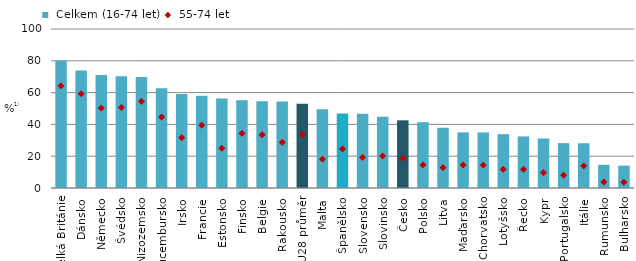
| Category |  Celkem (16-74 let) |
|---|---|
| Velká Británie | 80.082 |
| Dánsko | 73.886 |
| Německo | 71.008 |
| Švédsko | 70.286 |
| Nizozemsko | 69.882 |
| Lucembursko | 62.713 |
| Irsko | 59.195 |
| Francie | 57.962 |
| Estonsko | 56.297 |
| Finsko | 55.226 |
| Belgie | 54.606 |
| Rakousko | 54.433 |
| EU28 průměr | 52.918 |
| Malta | 49.548 |
| Španělsko | 46.925 |
| Slovensko | 46.762 |
| Slovinsko | 44.791 |
| Česko | 42.564 |
| Polsko | 41.385 |
| Litva | 37.877 |
| Maďarsko | 35.009 |
| Chorvatsko | 34.971 |
| Lotyšsko | 33.864 |
| Řecko | 32.432 |
| Kypr | 31.13 |
| Portugalsko | 28.217 |
| Itálie | 28.15 |
| Rumunsko | 14.592 |
| Bulharsko | 14.048 |